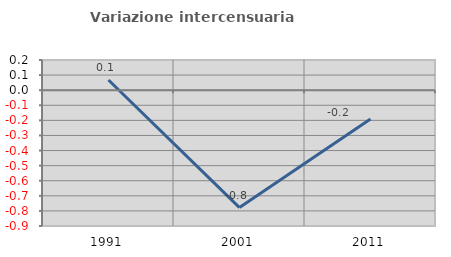
| Category | Variazione intercensuaria annua |
|---|---|
| 1991.0 | 0.067 |
| 2001.0 | -0.778 |
| 2011.0 | -0.191 |